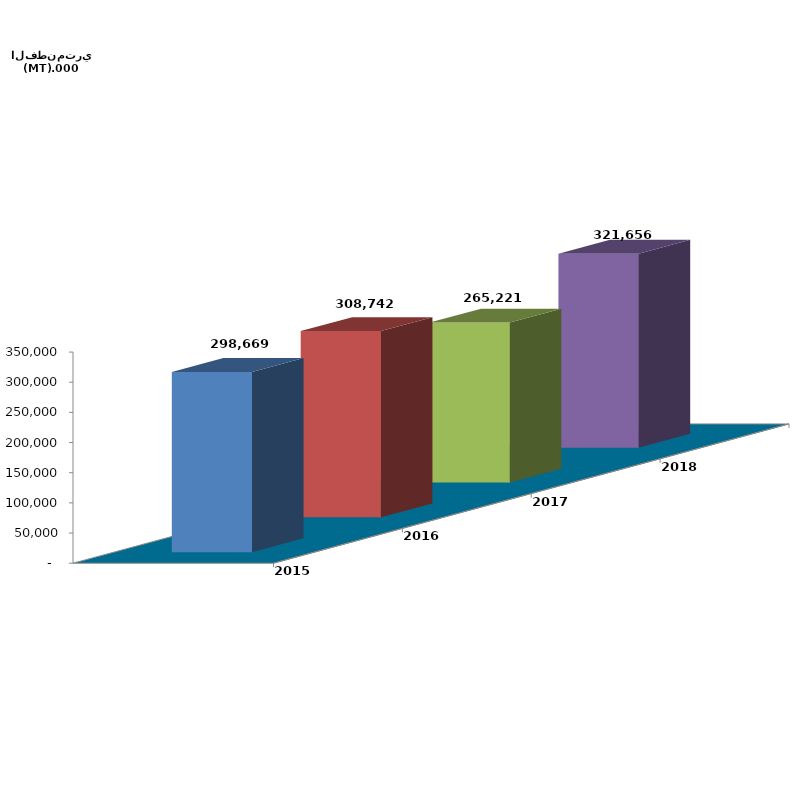
| Category | 2015 | 2016 | 2017 | 2018 |
|---|---|---|---|---|
| 0 | 298669 | 308741.808 | 265220.521 | 321655.847 |